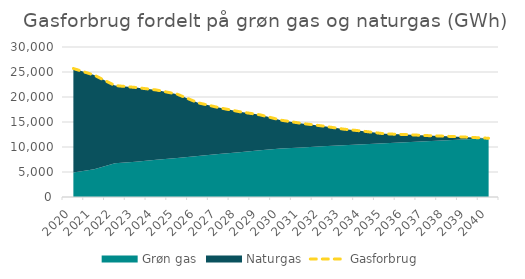
| Category | Gasforbrug |
|---|---|
| 2020.0 | 25697.285 |
| 2021.0 | 24383.209 |
| 2022.0 | 22293.753 |
| 2023.0 | 21906.588 |
| 2024.0 | 21405.508 |
| 2025.0 | 20566.53 |
| 2026.0 | 18842.574 |
| 2027.0 | 17881.855 |
| 2028.0 | 17058.079 |
| 2029.0 | 16426.153 |
| 2030.0 | 15363.838 |
| 2031.0 | 14723.396 |
| 2032.0 | 14200.177 |
| 2033.0 | 13581.755 |
| 2034.0 | 13148.097 |
| 2035.0 | 12630.694 |
| 2036.0 | 12488.028 |
| 2037.0 | 12287.874 |
| 2038.0 | 12142.35 |
| 2039.0 | 11958.878 |
| 2040.0 | 11747.761 |